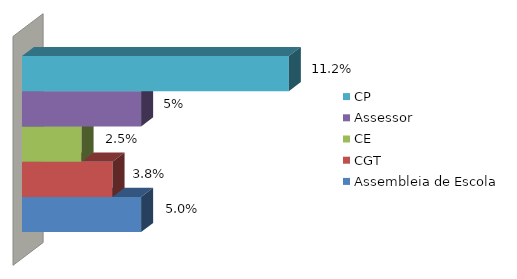
| Category | Assembleia de Escola | CGT | CE | Assessor | CP |
|---|---|---|---|---|---|
| 0 | 0.05 | 0.038 | 0.025 | 0.05 | 0.112 |